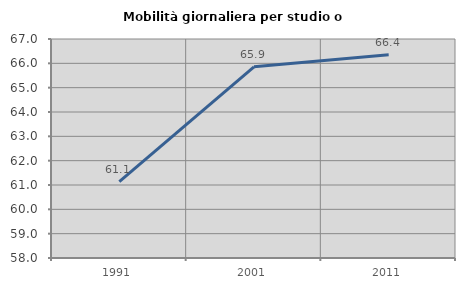
| Category | Mobilità giornaliera per studio o lavoro |
|---|---|
| 1991.0 | 61.142 |
| 2001.0 | 65.858 |
| 2011.0 | 66.353 |